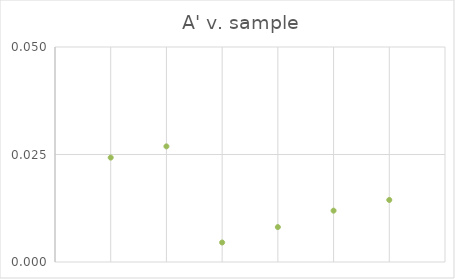
| Category | A' |
|---|---|
| 0 | 0.024 |
| 1 | 0.027 |
| 2 | 0.005 |
| 3 | 0.008 |
| 4 | 0.012 |
| 5 | 0.014 |